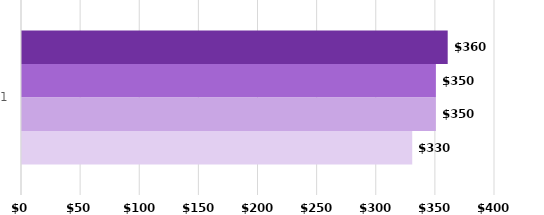
| Category | Roommate 1 | Roommate 2 | Roommate 3 | Roommate 4 |
|---|---|---|---|---|
| 0 | 360 | 350 | 350 | 330 |